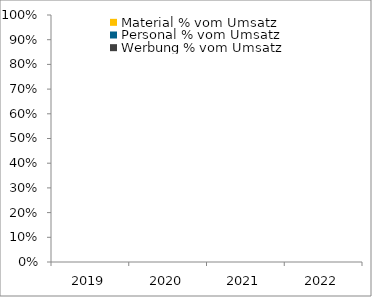
| Category | Material % vom Umsatz | Personal % vom Umsatz | Werbung % vom Umsatz |
|---|---|---|---|
| 2019.0 | 0 | 0 | 0 |
| 2020.0 | 0 | 0 | 0 |
| 2021.0 | 0 | 0 | 0 |
| 2022.0 | 0 | 0 | 0 |